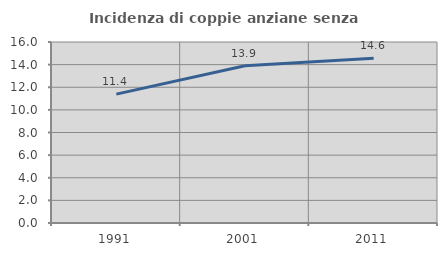
| Category | Incidenza di coppie anziane senza figli  |
|---|---|
| 1991.0 | 11.392 |
| 2001.0 | 13.897 |
| 2011.0 | 14.555 |